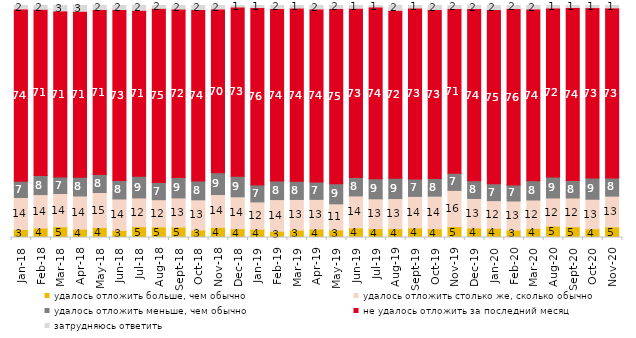
| Category | удалось отложить больше, чем обычно | удалось отложить столько же, сколько обычно | удалось отложить меньше, чем обычно | не удалось отложить за последний месяц | затрудняюсь ответить |
|---|---|---|---|---|---|
| 2018-01-01 | 3.45 | 13.8 | 7 | 73.9 | 1.85 |
| 2018-02-01 | 4.05 | 14.45 | 8.25 | 71.3 | 1.95 |
| 2018-03-01 | 4.6 | 14.35 | 7.1 | 71.3 | 2.65 |
| 2018-04-01 | 3.6 | 14.3 | 8.05 | 71.25 | 2.8 |
| 2018-05-01 | 4.3 | 15.1 | 7.75 | 70.75 | 2.1 |
| 2018-06-01 | 3.05 | 13.55 | 7.95 | 73.4 | 2.05 |
| 2018-07-01 | 4.65 | 12.4 | 9.35 | 71.2 | 2.4 |
| 2018-08-01 | 4.55 | 11.75 | 7.45 | 74.7 | 1.55 |
| 2018-09-01 | 4.5 | 12.55 | 8.8 | 72.3 | 1.85 |
| 2018-10-01 | 3.2 | 13.05 | 8.05 | 73.6 | 2.1 |
| 2018-11-01 | 4.341 | 14.172 | 9.381 | 70.259 | 1.846 |
| 2018-12-01 | 3.8 | 13.75 | 8.9 | 72.55 | 1 |
| 2019-01-01 | 3.55 | 11.8 | 7.25 | 76.1 | 1.3 |
| 2019-02-01 | 2.7 | 13.65 | 7.95 | 74.05 | 1.65 |
| 2019-03-01 | 3.182 | 13.227 | 7.857 | 74.291 | 1.442 |
| 2019-04-01 | 3.614 | 12.822 | 7.475 | 74.257 | 1.832 |
| 2019-05-01 | 3.219 | 11.293 | 8.618 | 75.285 | 1.585 |
| 2019-06-01 | 4.14 | 13.766 | 7.93 | 72.668 | 1.496 |
| 2019-07-01 | 3.812 | 12.871 | 8.663 | 73.663 | 0.99 |
| 2019-08-01 | 3.796 | 12.987 | 8.791 | 72.028 | 2.398 |
| 2019-09-01 | 4.158 | 13.564 | 7.475 | 73.366 | 1.436 |
| 2019-10-01 | 3.762 | 14.059 | 7.574 | 72.525 | 2.079 |
| 2019-11-01 | 4.703 | 15.594 | 7.376 | 70.743 | 1.584 |
| 2019-12-01 | 4.109 | 12.723 | 7.624 | 73.812 | 1.733 |
| 2020-01-01 | 3.96 | 11.931 | 7.228 | 74.703 | 2.178 |
| 2020-02-01 | 3.168 | 12.574 | 6.931 | 75.693 | 1.634 |
| 2020-03-01 | 3.917 | 12.246 | 8.28 | 73.723 | 1.834 |
| 2020-08-01 | 4.916 | 12.115 | 9.086 | 72.493 | 1.39 |
| 2020-09-01 | 4.629 | 12.394 | 7.566 | 74.216 | 1.195 |
| 2020-10-01 | 3.737 | 12.755 | 9.118 | 73.044 | 1.345 |
| 2020-11-01 | 4.55 | 13.3 | 7.85 | 72.95 | 1.35 |